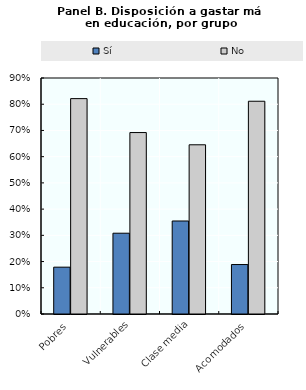
| Category | Sí | No |
|---|---|---|
| Pobres | 0.179 | 0.821 |
| Vulnerables | 0.308 | 0.692 |
| Clase media | 0.355 | 0.645 |
| Acomodados | 0.189 | 0.811 |